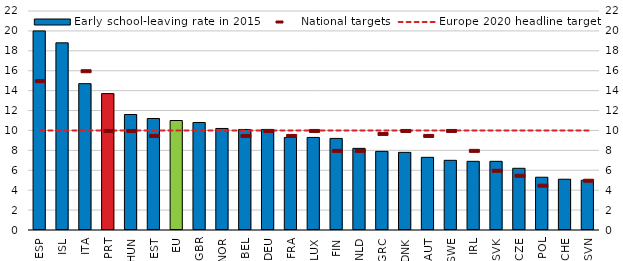
| Category | Early school-leaving rate in 2015 |
|---|---|
| ESP | 20 |
| ISL | 18.8 |
| ITA | 14.7 |
| PRT | 13.7 |
| HUN | 11.6 |
| EST | 11.2 |
| EU | 11 |
| GBR | 10.8 |
| NOR | 10.2 |
| BEL | 10.1 |
| DEU | 10.1 |
| FRA | 9.3 |
| LUX | 9.3 |
| FIN | 9.2 |
| NLD | 8.2 |
| GRC | 7.9 |
| DNK | 7.8 |
| AUT | 7.3 |
| SWE | 7 |
| IRL | 6.9 |
| SVK | 6.9 |
| CZE | 6.2 |
| POL | 5.3 |
| CHE | 5.1 |
| SVN | 5 |